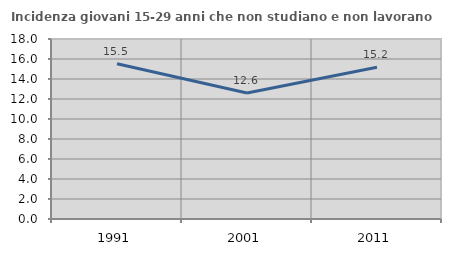
| Category | Incidenza giovani 15-29 anni che non studiano e non lavorano  |
|---|---|
| 1991.0 | 15.521 |
| 2001.0 | 12.603 |
| 2011.0 | 15.172 |